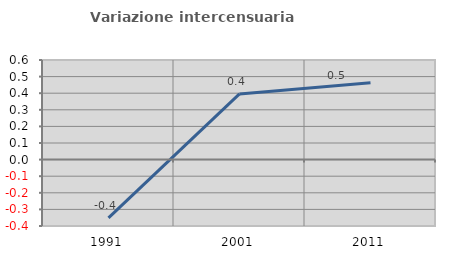
| Category | Variazione intercensuaria annua |
|---|---|
| 1991.0 | -0.351 |
| 2001.0 | 0.396 |
| 2011.0 | 0.464 |